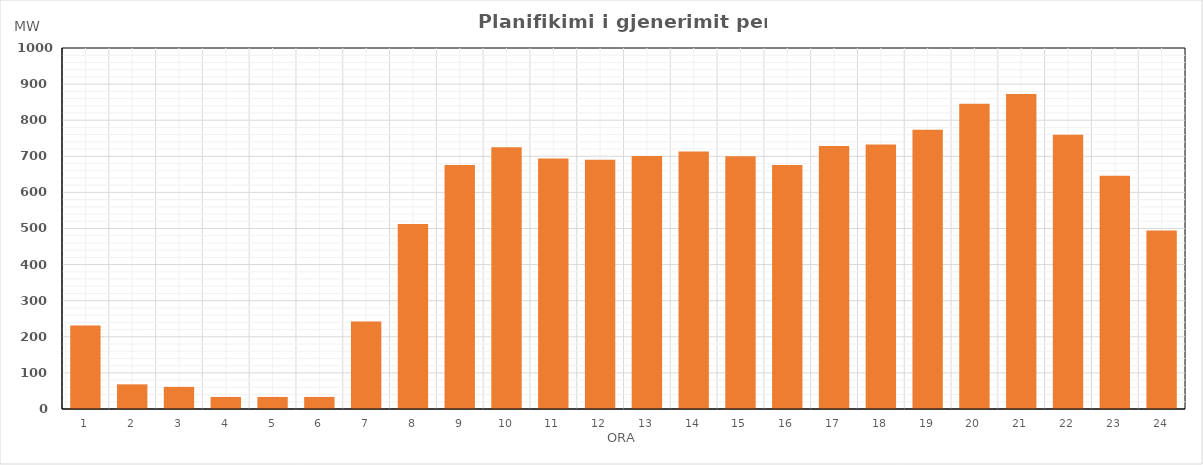
| Category | Max (MW) |
|---|---|
| 0 | 231.164 |
| 1 | 68.309 |
| 2 | 61.274 |
| 3 | 33.4 |
| 4 | 33.4 |
| 5 | 33.4 |
| 6 | 242.048 |
| 7 | 512.188 |
| 8 | 675.948 |
| 9 | 725.168 |
| 10 | 694.003 |
| 11 | 690.103 |
| 12 | 701.143 |
| 13 | 713.188 |
| 14 | 700.163 |
| 15 | 676.108 |
| 16 | 728.378 |
| 17 | 732.393 |
| 18 | 773.549 |
| 19 | 845.503 |
| 20 | 872.729 |
| 21 | 759.514 |
| 22 | 646.024 |
| 23 | 494.469 |